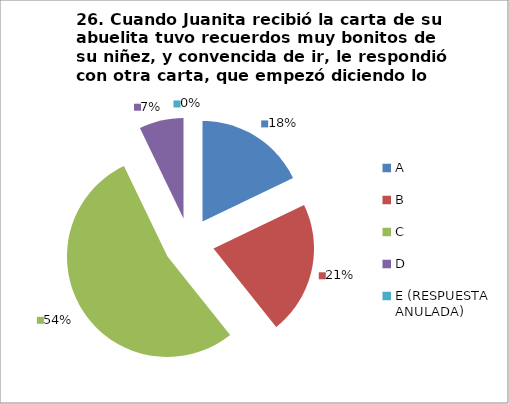
| Category | CANTIDAD DE RESPUESTAS PREGUNTA (23) | PORCENTAJE |
|---|---|---|
| A | 5 | 0.179 |
| B | 6 | 0.214 |
| C | 15 | 0.536 |
| D | 2 | 0.071 |
| E (RESPUESTA ANULADA) | 0 | 0 |